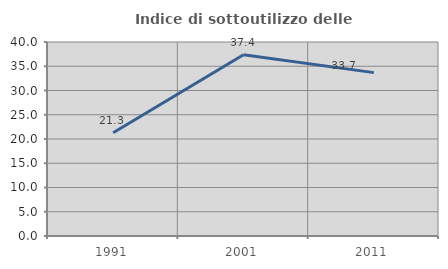
| Category | Indice di sottoutilizzo delle abitazioni  |
|---|---|
| 1991.0 | 21.29 |
| 2001.0 | 37.356 |
| 2011.0 | 33.687 |